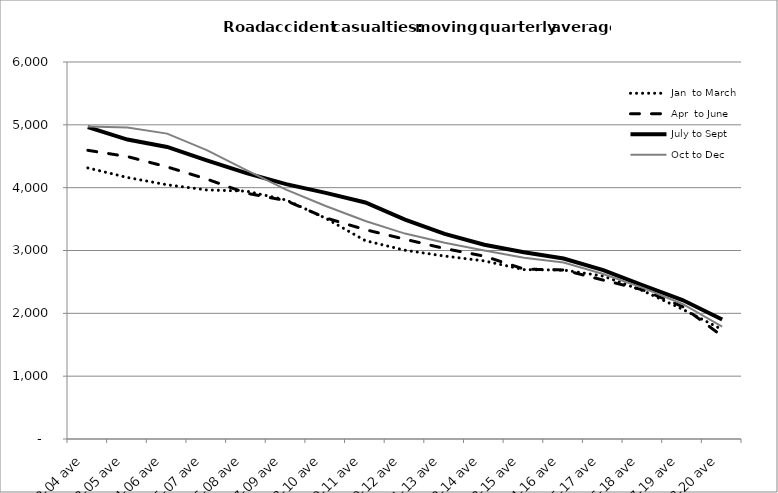
| Category | Jan  to March | Apr  to June | July to Sept | Oct to Dec |
|---|---|---|---|---|
| 2002-04 ave | 4314 | 4594.667 | 4963 | 4972.667 |
| 2003-05 ave | 4161.667 | 4494.667 | 4766 | 4958.667 |
| 2004-06 ave | 4046 | 4330.667 | 4648.667 | 4860 |
| 2005-07 ave | 3963.667 | 4137 | 4433 | 4597.333 |
| 2006-08 ave | 3945 | 3912.333 | 4231.667 | 4277.667 |
| 2007-09 ave | 3804.667 | 3793.667 | 4056.333 | 3970 |
| 2008-10 ave | 3512.667 | 3519 | 3917.667 | 3708.333 |
| 2009-11 ave | 3156.333 | 3331.333 | 3764.333 | 3470 |
| 2010-12 ave | 3004.333 | 3179.333 | 3492.333 | 3269 |
| 2011-13 ave | 2911.333 | 3031.333 | 3265 | 3122 |
| 2012-14 ave | 2834.333 | 2910 | 3091 | 3000 |
| 2013-15 ave | 2695.333 | 2704.333 | 2973.667 | 2883.667 |
| 2014-16 ave | 2689.333 | 2690 | 2872 | 2807.667 |
| 2015-17 ave | 2593.333 | 2529 | 2688.333 | 2625.333 |
| 2016-18 ave | 2359.333 | 2374 | 2446.333 | 2405.333 |
| 2017-19 ave | 2065.333 | 2107.667 | 2212 | 2149 |
| 2018-20 ave | 1742 | 1637.667 | 1900.667 | 1789.333 |